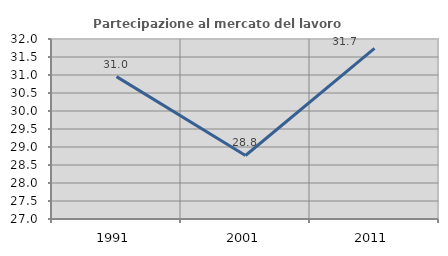
| Category | Partecipazione al mercato del lavoro  femminile |
|---|---|
| 1991.0 | 30.954 |
| 2001.0 | 28.764 |
| 2011.0 | 31.74 |